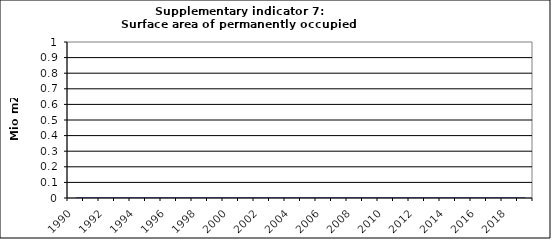
| Category | Surface area of permanently occupied dwellings, Mio m2  |
|---|---|
| 1990 | 0 |
| 1991 | 0 |
| 1992 | 0 |
| 1993 | 0 |
| 1994 | 0 |
| 1995 | 0 |
| 1996 | 0 |
| 1997 | 0 |
| 1998 | 0 |
| 1999 | 0 |
| 2000 | 0 |
| 2001 | 0 |
| 2002 | 0 |
| 2003 | 0 |
| 2004 | 0 |
| 2005 | 0 |
| 2006 | 0 |
| 2007 | 0 |
| 2008 | 0 |
| 2009 | 0 |
| 2010 | 0 |
| 2011 | 0 |
| 2012 | 0 |
| 2013 | 0 |
| 2014 | 0 |
| 2015 | 0 |
| 2016 | 0 |
| 2017 | 0 |
| 2018 | 0 |
| 2019 | 0 |